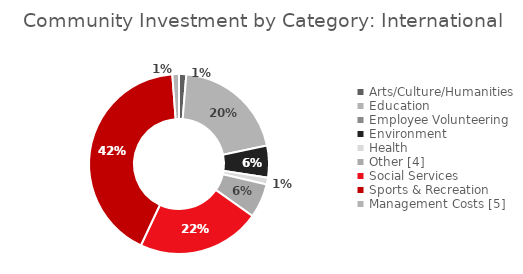
| Category | Series 0 |
|---|---|
| Arts/Culture/Humanities | 0.013 |
| Education | 0.204 |
| Employee Volunteering  | 0 |
| Environment | 0.057 |
| Health | 0.012 |
| Other [4] | 0.061 |
| Social Services | 0.222 |
| Sports & Recreation | 0.419 |
| Management Costs [5] | 0.012 |